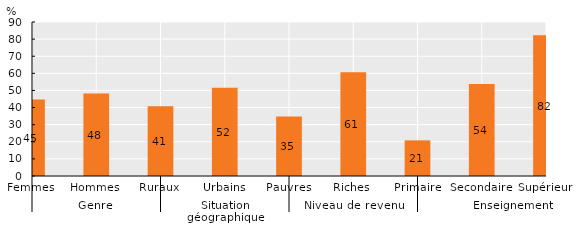
| Category | Series 0 |
|---|---|
| 0 | 44.761 |
| 1 | 48.263 |
| 2 | 40.692 |
| 3 | 51.555 |
| 4 | 34.78 |
| 5 | 60.617 |
| 6 | 20.824 |
| 7 | 53.822 |
| 8 | 82.233 |